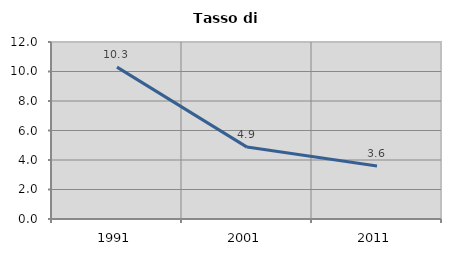
| Category | Tasso di disoccupazione   |
|---|---|
| 1991.0 | 10.296 |
| 2001.0 | 4.874 |
| 2011.0 | 3.591 |